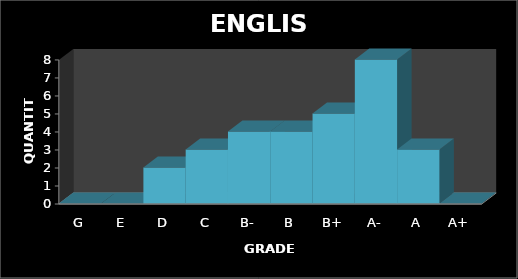
| Category | QUANTITY |
|---|---|
| G | 0 |
| E | 0 |
| D | 2 |
| C | 3 |
| B- | 4 |
| B | 4 |
| B+ | 5 |
| A- | 8 |
| A | 3 |
| A+ | 0 |